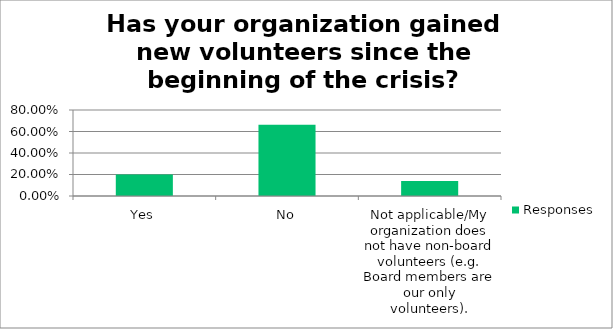
| Category | Responses |
|---|---|
| Yes | 0.2 |
| No | 0.662 |
| Not applicable/My organization does not have non-board volunteers (e.g. Board members are our only volunteers). | 0.139 |